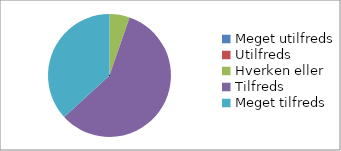
| Category | Hvor tilfreds er du med arrangementets praktiske afvikling - faciliteterne? (n=38) |
|---|---|
| Meget utilfreds | 0 |
| Utilfreds | 0 |
| Hverken eller | 0.053 |
| Tilfreds | 0.579 |
| Meget tilfreds | 0.368 |